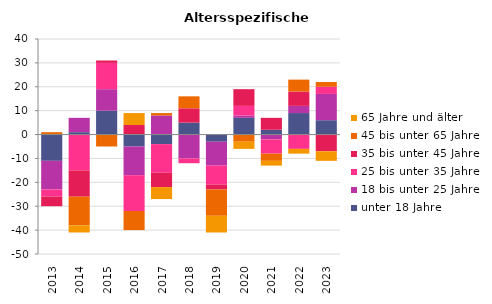
| Category | unter 18 Jahre | 18 bis unter 25 Jahre | 25 bis unter 35 Jahre | 35 bis unter 45 Jahre | 45 bis unter 65 Jahre | 65 Jahre und älter |
|---|---|---|---|---|---|---|
| 2013.0 | -11 | -12 | -3 | -4 | 1 | 0 |
| 2014.0 | 1 | 6 | -15 | -11 | -12 | -3 |
| 2015.0 | 10 | 9 | 11 | 1 | -5 | 0 |
| 2016.0 | -5 | -12 | -15 | 4 | -8 | 5 |
| 2017.0 | -4 | 8 | -12 | -6 | 1 | -5 |
| 2018.0 | 5 | -10 | -2 | 6 | 5 | 0 |
| 2019.0 | -3 | -10 | -8 | -2 | -11 | -7 |
| 2020.0 | 7 | 1 | 4 | 7 | -3 | -3 |
| 2021.0 | 2 | -2 | -6 | 5 | -3 | -2 |
| 2022.0 | 9 | 3 | -6 | 6 | 5 | -2 |
| 2023.0 | 6 | 11 | 3 | -7 | 2 | -4 |